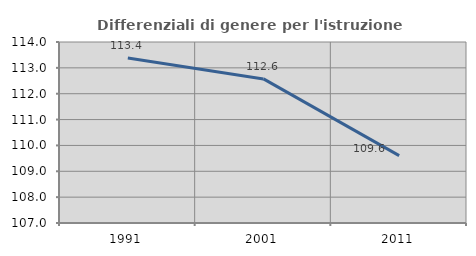
| Category | Differenziali di genere per l'istruzione superiore |
|---|---|
| 1991.0 | 113.378 |
| 2001.0 | 112.572 |
| 2011.0 | 109.604 |